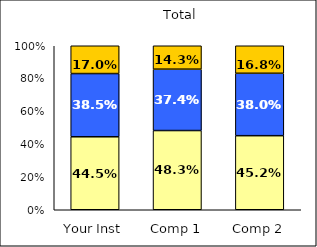
| Category | Low Likelihood of College Involvement | Average Likelihood of College Involvement | High Likelihood of College Involvement |
|---|---|---|---|
| Your Inst | 0.445 | 0.385 | 0.17 |
| Comp 1 | 0.483 | 0.374 | 0.143 |
| Comp 2 | 0.452 | 0.38 | 0.168 |